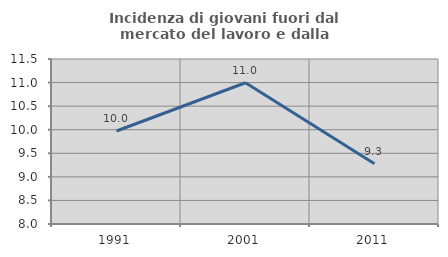
| Category | Incidenza di giovani fuori dal mercato del lavoro e dalla formazione  |
|---|---|
| 1991.0 | 9.972 |
| 2001.0 | 10.996 |
| 2011.0 | 9.279 |